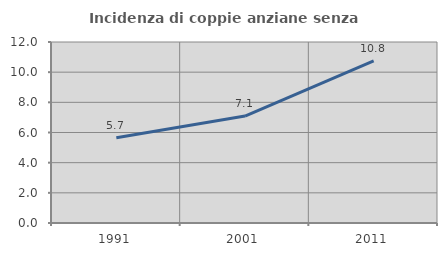
| Category | Incidenza di coppie anziane senza figli  |
|---|---|
| 1991.0 | 5.657 |
| 2001.0 | 7.088 |
| 2011.0 | 10.753 |